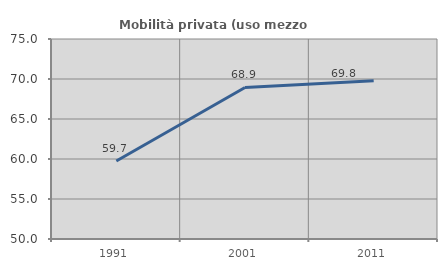
| Category | Mobilità privata (uso mezzo privato) |
|---|---|
| 1991.0 | 59.741 |
| 2001.0 | 68.941 |
| 2011.0 | 69.782 |